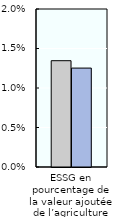
| Category | 2000-02 | 2018-20 |
|---|---|---|
| ESSG en pourcentage de la valeur ajoutée de l’agriculture | 0.013 | 0.013 |